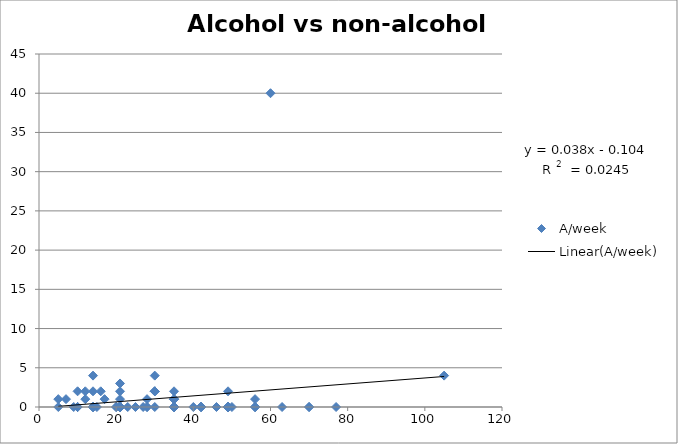
| Category | A/week |
|---|---|
| 28.0 | 1 |
| 35.0 | 0 |
| 40.0 | 0 |
| 46.0 | 0 |
| 70.0 | 0 |
| 27.0 | 0 |
| 35.0 | 0 |
| 17.0 | 1 |
| 15.0 | 0 |
| 21.0 | 0 |
| 7.0 | 1 |
| 16.0 | 2 |
| 21.0 | 2 |
| 21.0 | 0 |
| 21.0 | 1 |
| 56.0 | 1 |
| 35.0 | 1 |
| 30.0 | 2 |
| 20.0 | 0 |
| 28.0 | 0 |
| 21.0 | 0 |
| 35.0 | 2 |
| 21.0 | 0 |
| 10.0 | 0 |
| 14.0 | 2 |
| 35.0 | 1 |
| 49.0 | 0 |
| 14.0 | 0 |
| 49.0 | 0 |
| 49.0 | 0 |
| 42.0 | 0 |
| 49.0 | 0 |
| 49.0 | 0 |
| 49.0 | 2 |
| 49.0 | 0 |
| 28.0 | 0 |
| 42.0 | 0 |
| 56.0 | 0 |
| 49.0 | 0 |
| 35.0 | 0 |
| 56.0 | 0 |
| 77.0 | 0 |
| 70.0 | 0 |
| 35.0 | 0 |
| 105.0 | 4 |
| 42.0 | 0.038 |
| 35.0 | 1 |
| 42.0 | 0 |
| 56.0 | 0 |
| 63.0 | 0 |
| 9.0 | 0 |
| 20.0 | 0 |
| 14.0 | 4 |
| 10.0 | 0 |
| 50.0 | 0 |
| 60.0 | 40 |
| 30.0 | 2 |
| 30.0 | 2 |
| 30.0 | 4 |
| 10.0 | 2 |
| 12.0 | 1 |
| 14.0 | 0 |
| 14.0 | 0 |
| 10.0 | 0 |
| 14.0 | 0 |
| 5.0 | 0 |
| 5.0 | 1 |
| 21.0 | 0 |
| 30.0 | 0 |
| 12.0 | 2 |
| 21.0 | 0 |
| 35.0 | 0 |
| 21.0 | 3 |
| 23.0 | 0 |
| 25.0 | 0 |